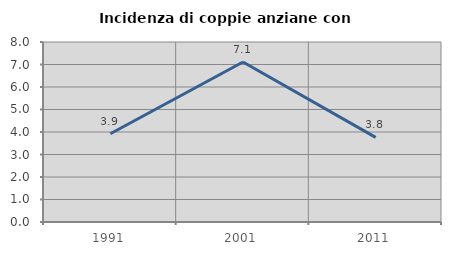
| Category | Incidenza di coppie anziane con figli |
|---|---|
| 1991.0 | 3.922 |
| 2001.0 | 7.109 |
| 2011.0 | 3.763 |